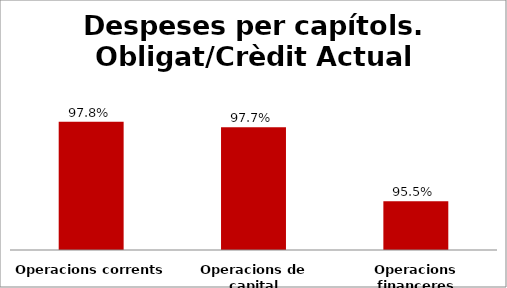
| Category | Series 0 |
|---|---|
| Operacions corrents | 0.978 |
| Operacions de capital | 0.977 |
| Operacions financeres | 0.955 |